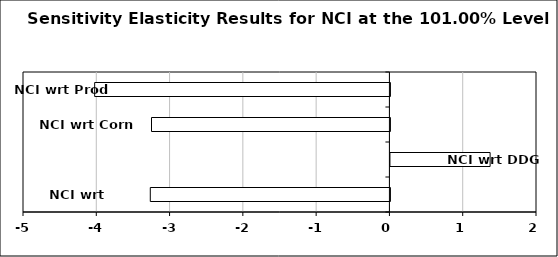
| Category | Series 0 |
|---|---|
| NCI wrt Corn/Ethanol | -3.27 |
| NCI wrt DDG Price | 1.36 |
| NCI wrt Corn Price | -3.253 |
| NCI wrt Prod Cost | -4.029 |